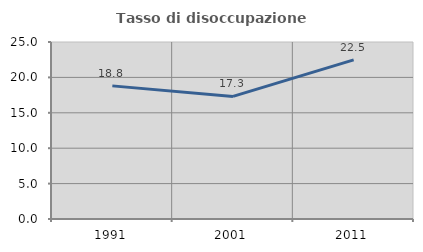
| Category | Tasso di disoccupazione giovanile  |
|---|---|
| 1991.0 | 18.802 |
| 2001.0 | 17.312 |
| 2011.0 | 22.478 |